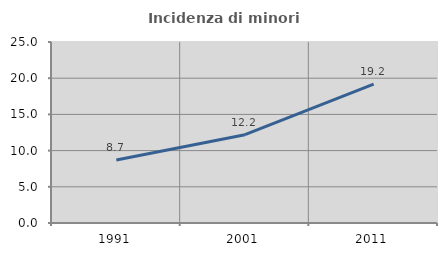
| Category | Incidenza di minori stranieri |
|---|---|
| 1991.0 | 8.696 |
| 2001.0 | 12.195 |
| 2011.0 | 19.192 |